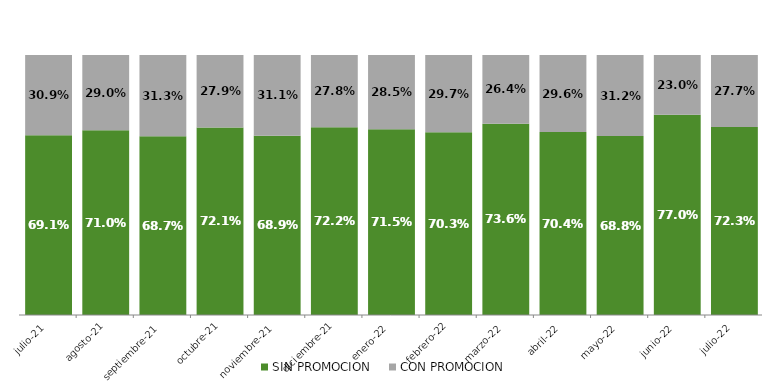
| Category | SIN PROMOCION   | CON PROMOCION   |
|---|---|---|
| 2021-07-01 | 0.691 | 0.309 |
| 2021-08-01 | 0.71 | 0.29 |
| 2021-09-01 | 0.687 | 0.313 |
| 2021-10-01 | 0.721 | 0.279 |
| 2021-11-01 | 0.689 | 0.311 |
| 2021-12-01 | 0.722 | 0.278 |
| 2022-01-01 | 0.715 | 0.285 |
| 2022-02-01 | 0.703 | 0.297 |
| 2022-03-01 | 0.736 | 0.264 |
| 2022-04-01 | 0.704 | 0.296 |
| 2022-05-01 | 0.688 | 0.312 |
| 2022-06-01 | 0.77 | 0.23 |
| 2022-07-01 | 0.723 | 0.277 |